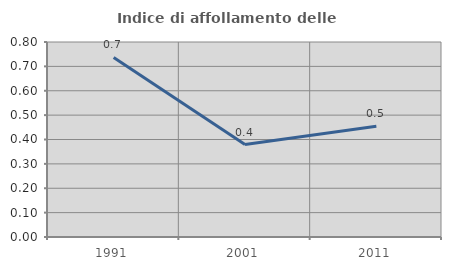
| Category | Indice di affollamento delle abitazioni  |
|---|---|
| 1991.0 | 0.737 |
| 2001.0 | 0.379 |
| 2011.0 | 0.455 |